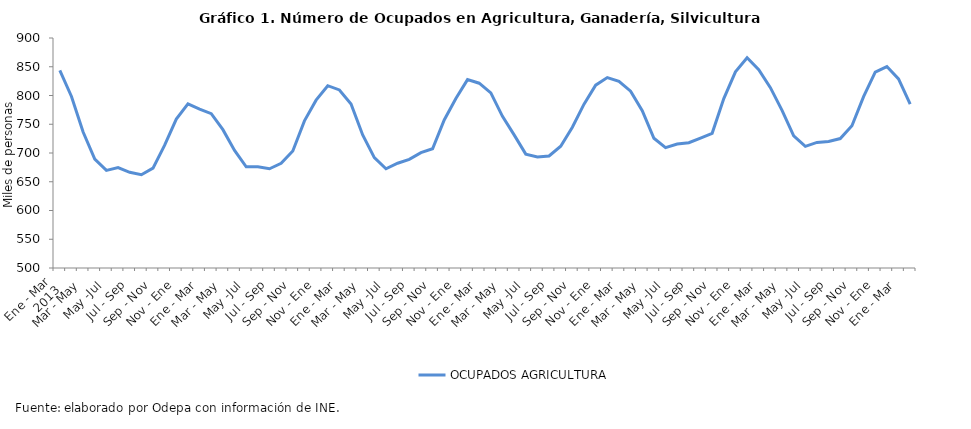
| Category | OCUPADOS AGRICULTURA |
|---|---|
| 0 | 843.658 |
| 1 | 798.266 |
| 2 | 736.461 |
| 3 | 689.358 |
| 4 | 669.839 |
| 5 | 674.791 |
| 6 | 666.406 |
| 7 | 662.262 |
| 8 | 673.724 |
| 9 | 713.604 |
| 10 | 758.988 |
| 11 | 785.537 |
| 12 | 776.373 |
| 13 | 768.303 |
| 14 | 740.609 |
| 15 | 704.367 |
| 16 | 675.938 |
| 17 | 676.058 |
| 18 | 672.6 |
| 19 | 682.074 |
| 20 | 703.599 |
| 21 | 755.905 |
| 22 | 791.902 |
| 23 | 817.027 |
| 24 | 809.646 |
| 25 | 785.301 |
| 26 | 731.282 |
| 27 | 691.978 |
| 28 | 672.526 |
| 29 | 682.164 |
| 30 | 689.034 |
| 31 | 700.719 |
| 32 | 707.439 |
| 33 | 757.522 |
| 34 | 794.669 |
| 35 | 827.605 |
| 36 | 821.367 |
| 37 | 804.582 |
| 38 | 763.826 |
| 39 | 731.558 |
| 40 | 698.04 |
| 41 | 692.989 |
| 42 | 694.776 |
| 43 | 711.757 |
| 44 | 744.739 |
| 45 | 785.03 |
| 46 | 818.051 |
| 47 | 831.11 |
| 48 | 824.789 |
| 49 | 807.606 |
| 50 | 773.662 |
| 51 | 725.597 |
| 52 | 709.369 |
| 53 | 715.675 |
| 54 | 717.856 |
| 55 | 725.965 |
| 56 | 734.277 |
| 57 | 794.66 |
| 58 | 841.147 |
| 59 | 865.659 |
| 60 | 845.074 |
| 61 | 813.586 |
| 62 | 774.131 |
| 63 | 729.695 |
| 64 | 711.581 |
| 65 | 718.419 |
| 66 | 720.091 |
| 67 | 725.105 |
| 68 | 747.425 |
| 69 | 798.027 |
| 70 | 840.667 |
| 71 | 850.292 |
| 72 | 828.766 |
| 73 | 785.1 |